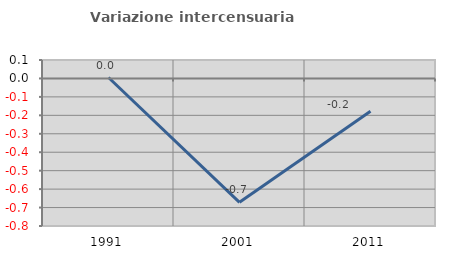
| Category | Variazione intercensuaria annua |
|---|---|
| 1991.0 | 0.005 |
| 2001.0 | -0.672 |
| 2011.0 | -0.177 |